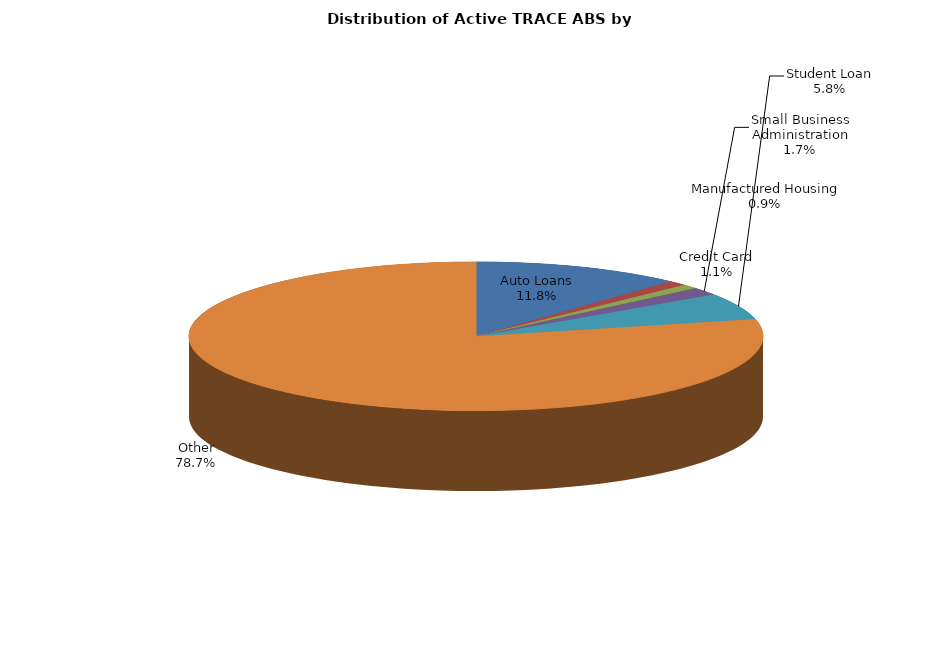
| Category | Series 0 |
|---|---|
| Auto Loans | 2707 |
| Credit Card | 243 |
| Manufactured Housing | 211 |
| Small Business Administration | 380 |
| Student Loan | 1331 |
| Other | 18027 |